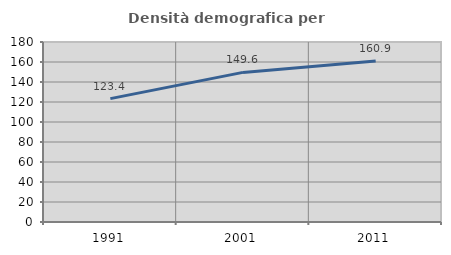
| Category | Densità demografica |
|---|---|
| 1991.0 | 123.394 |
| 2001.0 | 149.606 |
| 2011.0 | 160.923 |